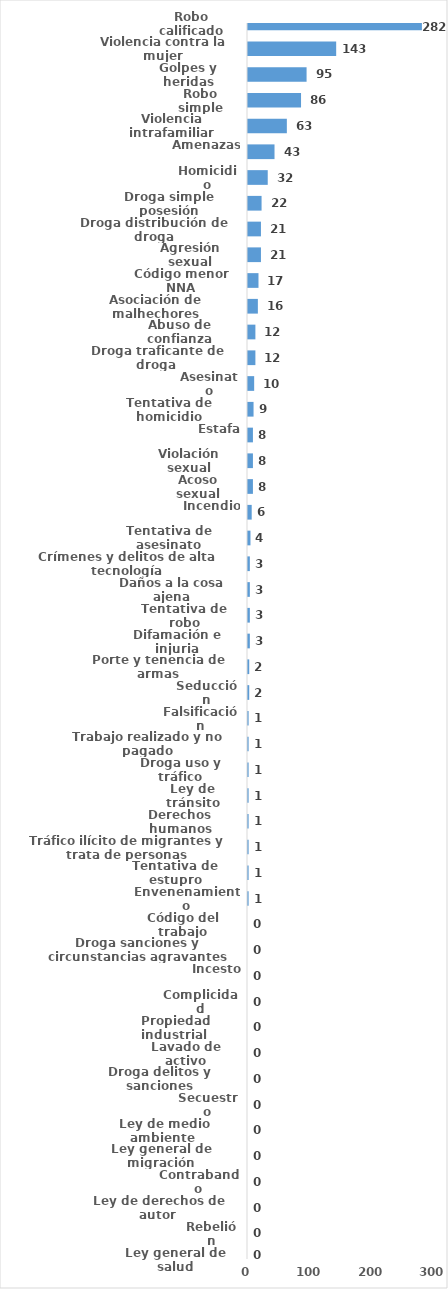
| Category | Series 0 |
|---|---|
| Robo calificado | 282 |
| Violencia contra la mujer | 143 |
| Golpes y heridas | 95 |
| Robo simple | 86 |
| Violencia intrafamiliar | 63 |
| Amenazas | 43 |
| Homicidio | 32 |
| Droga simple posesión | 22 |
| Droga distribución de droga | 21 |
| Agresión sexual | 21 |
| Código menor NNA | 17 |
| Asociación de malhechores | 16 |
| Abuso de confianza | 12 |
| Droga traficante de droga  | 12 |
| Asesinato | 10 |
| Tentativa de homicidio | 9 |
| Estafa | 8 |
| Violación sexual | 8 |
| Acoso sexual | 8 |
| Incendio | 6 |
| Tentativa de asesinato | 4 |
| Crímenes y delitos de alta tecnología | 3 |
| Daños a la cosa ajena | 3 |
| Tentativa de robo | 3 |
| Difamación e injuria | 3 |
| Porte y tenencia de armas | 2 |
| Seducción | 2 |
| Falsificación | 1 |
| Trabajo realizado y no pagado | 1 |
| Droga uso y tráfico | 1 |
| Ley de tránsito | 1 |
| Derechos humanos | 1 |
| Tráfico ilícito de migrantes y trata de personas | 1 |
| Tentativa de estupro | 1 |
| Envenenamiento | 1 |
| Código del trabajo | 0 |
| Droga sanciones y circunstancias agravantes | 0 |
| Incesto | 0 |
| Complicidad | 0 |
| Propiedad industrial  | 0 |
| Lavado de activo | 0 |
| Droga delitos y sanciones | 0 |
| Secuestro | 0 |
| Ley de medio ambiente  | 0 |
| Ley general de migración | 0 |
| Contrabando | 0 |
| Ley de derechos de autor  | 0 |
| Rebelión | 0 |
| Ley general de salud | 0 |